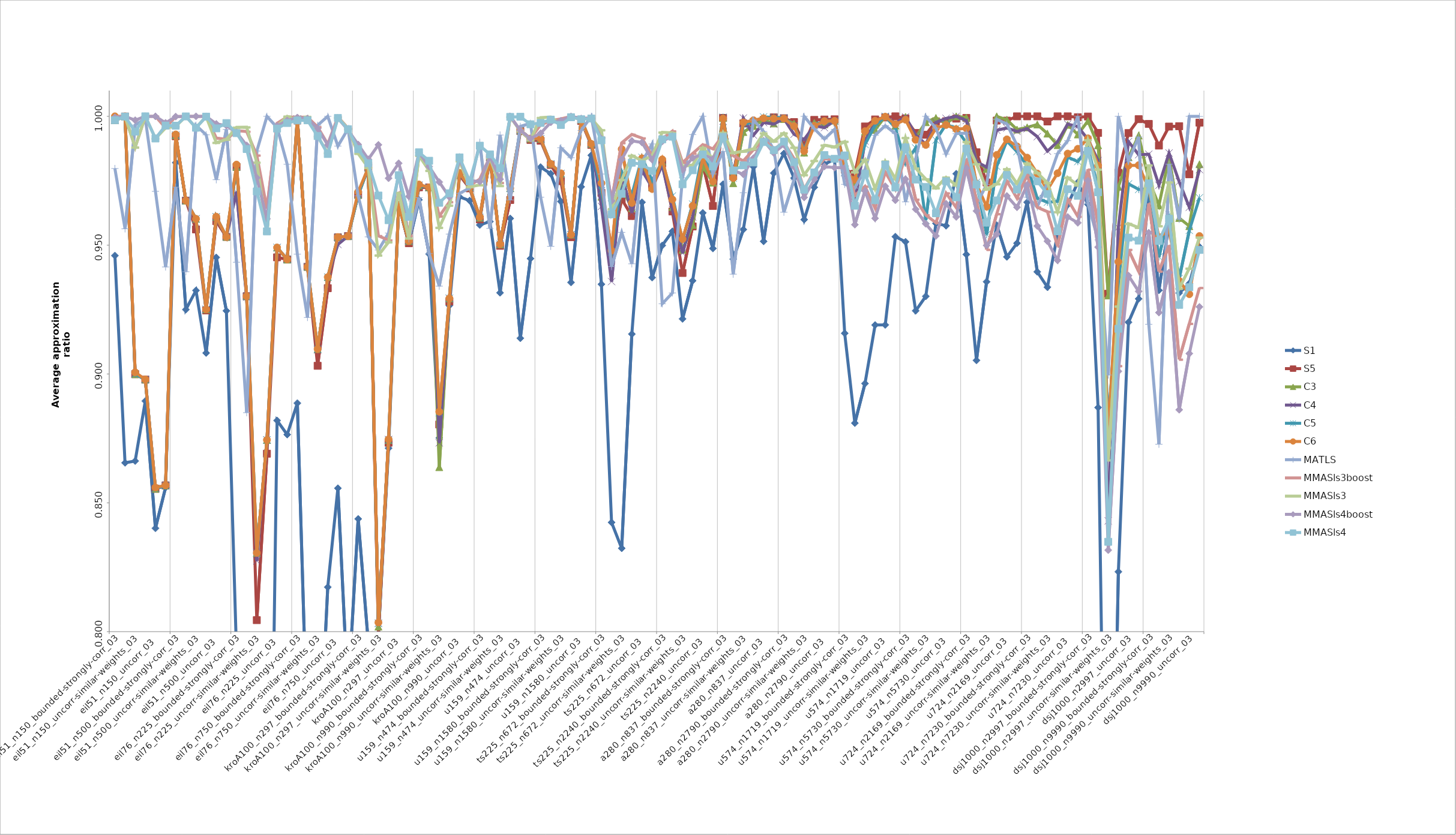
| Category | S1 | S5 | C3 | C4 | C5 | C6 | MATLS | MMASls3boost | MMASls3 | MMASls4boost | MMASls4 |
|---|---|---|---|---|---|---|---|---|---|---|---|
| eil51_n150_bounded-strongly-corr_03 | 0.946 | 0.999 | 0.999 | 0.999 | 0.999 | 1 | 0.98 | 1 | 0.999 | 1 | 0.999 |
| eil51_n150_bounded-strongly-corr_07 | 0.866 | 1 | 1 | 1 | 1 | 1 | 0.956 | 1 | 1 | 1 | 1 |
| eil51_n150_uncorr-similar-weights_03 | 0.866 | 0.9 | 0.9 | 0.9 | 0.9 | 0.901 | 0.997 | 0.988 | 0.988 | 0.998 | 0.994 |
| eil51_n150_uncorr-similar-weights_07 | 0.89 | 0.898 | 0.898 | 0.898 | 0.898 | 0.898 | 0.999 | 1 | 1 | 1 | 1 |
| eil51_n150_uncorr_03 | 0.84 | 0.855 | 0.855 | 0.856 | 0.855 | 0.856 | 0.971 | 1 | 0.991 | 1 | 0.991 |
| eil51_n150_uncorr_07 | 0.856 | 0.857 | 0.857 | 0.857 | 0.857 | 0.857 | 0.942 | 0.996 | 0.996 | 0.997 | 0.996 |
| eil51_n500_bounded-strongly-corr_03 | 0.982 | 0.992 | 0.993 | 0.993 | 0.993 | 0.993 | 0.973 | 1 | 0.996 | 1 | 0.996 |
| eil51_n500_bounded-strongly-corr_07 | 0.925 | 0.967 | 0.967 | 0.967 | 0.967 | 0.967 | 0.94 | 1 | 1 | 1 | 1 |
| eil51_n500_uncorr-similar-weights_03 | 0.932 | 0.956 | 0.96 | 0.96 | 0.96 | 0.96 | 0.997 | 1 | 0.996 | 1 | 0.996 |
| eil51_n500_uncorr-similar-weights_07 | 0.908 | 0.925 | 0.925 | 0.925 | 0.925 | 0.925 | 0.993 | 1 | 1 | 1 | 1 |
| eil51_n500_uncorr_03 | 0.945 | 0.959 | 0.961 | 0.961 | 0.961 | 0.961 | 0.975 | 0.992 | 0.99 | 0.997 | 0.995 |
| eil51_n500_uncorr_07 | 0.925 | 0.953 | 0.953 | 0.953 | 0.953 | 0.953 | 0.995 | 0.991 | 0.991 | 0.996 | 0.997 |
| eil76_n225_bounded-strongly-corr_03 | 0.792 | 0.98 | 0.98 | 0.971 | 0.98 | 0.981 | 0.943 | 0.994 | 0.996 | 0.994 | 0.993 |
| eil76_n225_bounded-strongly-corr_07 | 0.726 | 0.93 | 0.93 | 0.93 | 0.93 | 0.93 | 0.885 | 0.994 | 0.996 | 0.989 | 0.987 |
| eil76_n225_uncorr-similar-weights_03 | 0.575 | 0.804 | 0.831 | 0.827 | 0.831 | 0.831 | 0.987 | 0.985 | 0.982 | 0.976 | 0.971 |
| eil76_n225_uncorr-similar-weights_07 | 0.602 | 0.869 | 0.874 | 0.874 | 0.874 | 0.874 | 1 | 0.964 | 0.955 | 0.96 | 0.955 |
| eil76_n225_uncorr_03 | 0.882 | 0.945 | 0.949 | 0.949 | 0.949 | 0.949 | 0.996 | 0.997 | 0.996 | 0.996 | 0.995 |
| eil76_n225_uncorr_07 | 0.876 | 0.944 | 0.944 | 0.944 | 0.944 | 0.944 | 0.981 | 1 | 1 | 0.998 | 0.997 |
| eil76_n750_bounded-strongly-corr_03 | 0.889 | 0.998 | 0.999 | 0.999 | 0.999 | 0.999 | 0.947 | 1 | 0.998 | 1 | 0.998 |
| eil76_n750_bounded-strongly-corr_07 | 0.757 | 0.942 | 0.942 | 0.942 | 0.942 | 0.942 | 0.922 | 1 | 1 | 0.999 | 0.998 |
| eil76_n750_uncorr-similar-weights_03 | 0.736 | 0.903 | 0.91 | 0.909 | 0.91 | 0.91 | 0.997 | 0.996 | 0.992 | 0.995 | 0.992 |
| eil76_n750_uncorr-similar-weights_07 | 0.817 | 0.933 | 0.938 | 0.938 | 0.938 | 0.938 | 1 | 0.989 | 0.986 | 0.989 | 0.985 |
| eil76_n750_uncorr_03 | 0.856 | 0.953 | 0.953 | 0.95 | 0.953 | 0.953 | 0.988 | 1 | 1 | 0.999 | 0.999 |
| eil76_n750_uncorr_07 | 0.775 | 0.954 | 0.954 | 0.954 | 0.954 | 0.954 | 0.995 | 0.995 | 0.995 | 0.995 | 0.995 |
| kroA100_n297_bounded-strongly-corr_03 | 0.844 | 0.97 | 0.97 | 0.97 | 0.97 | 0.971 | 0.969 | 0.986 | 0.986 | 0.989 | 0.987 |
| kroA100_n297_bounded-strongly-corr_07 | 0.796 | 0.98 | 0.98 | 0.98 | 0.98 | 0.98 | 0.953 | 0.982 | 0.98 | 0.983 | 0.982 |
| kroA100_n297_uncorr-similar-weights_03 | 0.799 | 0.799 | 0.802 | 0.803 | 0.803 | 0.804 | 0.948 | 0.954 | 0.946 | 0.989 | 0.969 |
| kroA100_n297_uncorr-similar-weights_07 | 0.871 | 0.873 | 0.874 | 0.875 | 0.874 | 0.875 | 0.955 | 0.952 | 0.951 | 0.976 | 0.96 |
| kroA100_n297_uncorr_03 | 0.966 | 0.966 | 0.965 | 0.966 | 0.966 | 0.966 | 0.978 | 0.971 | 0.97 | 0.982 | 0.977 |
| kroA100_n297_uncorr_07 | 0.951 | 0.951 | 0.952 | 0.952 | 0.952 | 0.952 | 0.952 | 0.954 | 0.953 | 0.969 | 0.961 |
| kroA100_n990_bounded-strongly-corr_03 | 0.968 | 0.972 | 0.973 | 0.973 | 0.973 | 0.974 | 0.968 | 0.985 | 0.985 | 0.986 | 0.986 |
| kroA100_n990_bounded-strongly-corr_07 | 0.947 | 0.972 | 0.972 | 0.972 | 0.972 | 0.972 | 0.947 | 0.979 | 0.979 | 0.981 | 0.983 |
| kroA100_n990_uncorr-similar-weights_03 | 0.875 | 0.88 | 0.864 | 0.873 | 0.885 | 0.885 | 0.934 | 0.961 | 0.957 | 0.975 | 0.966 |
| kroA100_n990_uncorr-similar-weights_07 | 0.927 | 0.928 | 0.929 | 0.929 | 0.929 | 0.929 | 0.954 | 0.967 | 0.965 | 0.969 | 0.97 |
| kroA100_n990_uncorr_03 | 0.969 | 0.977 | 0.978 | 0.978 | 0.978 | 0.978 | 0.97 | 0.983 | 0.983 | 0.983 | 0.984 |
| kroA100_n990_uncorr_07 | 0.967 | 0.972 | 0.973 | 0.973 | 0.973 | 0.973 | 0.972 | 0.973 | 0.973 | 0.975 | 0.975 |
| u159_n474_bounded-strongly-corr_03 | 0.958 | 0.96 | 0.961 | 0.961 | 0.961 | 0.961 | 0.99 | 0.976 | 0.973 | 0.975 | 0.989 |
| u159_n474_bounded-strongly-corr_07 | 0.959 | 0.984 | 0.984 | 0.984 | 0.984 | 0.984 | 0.956 | 0.984 | 0.984 | 0.984 | 0.985 |
| u159_n474_uncorr-similar-weights_03 | 0.932 | 0.95 | 0.95 | 0.95 | 0.95 | 0.95 | 0.993 | 0.974 | 0.973 | 0.976 | 0.98 |
| u159_n474_uncorr-similar-weights_07 | 0.96 | 0.968 | 0.972 | 0.972 | 0.972 | 0.972 | 0.968 | 1 | 1 | 1 | 1 |
| u159_n474_uncorr_03 | 0.914 | 0.994 | 0.995 | 0.995 | 0.995 | 0.995 | 0.996 | 0.995 | 0.994 | 0.995 | 1 |
| u159_n474_uncorr_07 | 0.945 | 0.991 | 0.991 | 0.991 | 0.991 | 0.991 | 0.997 | 0.991 | 0.991 | 0.991 | 0.997 |
| u159_n1580_bounded-strongly-corr_03 | 0.98 | 0.991 | 0.991 | 0.991 | 0.991 | 0.991 | 0.969 | 0.997 | 0.999 | 0.993 | 0.997 |
| u159_n1580_bounded-strongly-corr_07 | 0.978 | 0.981 | 0.982 | 0.982 | 0.982 | 0.982 | 0.95 | 0.998 | 1 | 0.998 | 0.999 |
| u159_n1580_uncorr-similar-weights_03 | 0.967 | 0.975 | 0.978 | 0.978 | 0.978 | 0.978 | 0.988 | 0.999 | 0.997 | 0.998 | 0.997 |
| u159_n1580_uncorr-similar-weights_07 | 0.936 | 0.953 | 0.954 | 0.954 | 0.954 | 0.954 | 0.984 | 1 | 1 | 1 | 1 |
| u159_n1580_uncorr_03 | 0.973 | 0.998 | 0.999 | 0.999 | 0.999 | 0.999 | 0.995 | 0.999 | 0.999 | 0.999 | 0.999 |
| u159_n1580_uncorr_07 | 0.985 | 0.989 | 0.989 | 0.989 | 0.989 | 0.989 | 1 | 0.999 | 0.999 | 0.999 | 0.999 |
| ts225_n672_bounded-strongly-corr_03 | 0.935 | 0.97 | 0.969 | 0.965 | 0.971 | 0.974 | 0.978 | 0.992 | 0.995 | 0.991 | 0.991 |
| ts225_n672_bounded-strongly-corr_07 | 0.842 | 0.949 | 0.946 | 0.936 | 0.947 | 0.948 | 0.942 | 0.967 | 0.964 | 0.967 | 0.962 |
| ts225_n672_uncorr-similar-weights_03 | 0.832 | 0.968 | 0.972 | 0.977 | 0.979 | 0.987 | 0.955 | 0.99 | 0.975 | 0.983 | 0.97 |
| ts225_n672_uncorr-similar-weights_07 | 0.915 | 0.961 | 0.964 | 0.963 | 0.97 | 0.966 | 0.943 | 0.993 | 0.985 | 0.99 | 0.982 |
| ts225_n672_uncorr_03 | 0.967 | 0.981 | 0.981 | 0.979 | 0.984 | 0.984 | 0.982 | 0.992 | 0.983 | 0.99 | 0.981 |
| ts225_n672_uncorr_07 | 0.937 | 0.973 | 0.973 | 0.972 | 0.975 | 0.972 | 0.989 | 0.985 | 0.985 | 0.983 | 0.979 |
| ts225_n2240_bounded-strongly-corr_03 | 0.95 | 0.982 | 0.983 | 0.981 | 0.982 | 0.983 | 0.927 | 0.991 | 0.994 | 0.99 | 0.991 |
| ts225_n2240_bounded-strongly-corr_07 | 0.955 | 0.963 | 0.965 | 0.964 | 0.969 | 0.968 | 0.931 | 0.994 | 0.994 | 0.992 | 0.992 |
| ts225_n2240_uncorr-similar-weights_03 | 0.921 | 0.939 | 0.948 | 0.947 | 0.952 | 0.952 | 0.976 | 0.982 | 0.981 | 0.979 | 0.974 |
| ts225_n2240_uncorr-similar-weights_07 | 0.936 | 0.957 | 0.958 | 0.961 | 0.966 | 0.965 | 0.993 | 0.986 | 0.981 | 0.984 | 0.979 |
| ts225_n2240_uncorr_03 | 0.963 | 0.981 | 0.981 | 0.985 | 0.986 | 0.984 | 1 | 0.989 | 0.988 | 0.985 | 0.985 |
| ts225_n2240_uncorr_07 | 0.949 | 0.965 | 0.974 | 0.976 | 0.976 | 0.975 | 0.978 | 0.987 | 0.984 | 0.983 | 0.981 |
| a280_n837_bounded-strongly-corr_03 | 0.974 | 0.999 | 0.999 | 0.998 | 1 | 0.999 | 0.986 | 0.993 | 0.994 | 0.992 | 0.992 |
| a280_n837_bounded-strongly-corr_07 | 0.945 | 0.977 | 0.974 | 0.977 | 0.976 | 0.976 | 0.939 | 0.985 | 0.986 | 0.979 | 0.979 |
| a280_n837_uncorr-similar-weights_03 | 0.956 | 0.997 | 0.994 | 0.999 | 0.997 | 0.998 | 0.97 | 0.983 | 0.986 | 0.978 | 0.981 |
| a280_n837_uncorr-similar-weights_07 | 0.98 | 0.998 | 0.996 | 0.993 | 0.998 | 0.998 | 0.999 | 0.987 | 0.987 | 0.984 | 0.982 |
| a280_n837_uncorr_03 | 0.951 | 0.999 | 0.999 | 0.998 | 1 | 0.999 | 0.994 | 0.991 | 0.993 | 0.991 | 0.99 |
| a280_n837_uncorr_07 | 0.978 | 1 | 0.997 | 0.997 | 1 | 0.999 | 0.987 | 0.987 | 0.99 | 0.986 | 0.987 |
| a280_n2790_bounded-strongly-corr_03 | 0.986 | 0.999 | 0.999 | 0.999 | 0.999 | 0.999 | 0.963 | 0.99 | 0.993 | 0.989 | 0.99 |
| a280_n2790_bounded-strongly-corr_07 | 0.976 | 0.998 | 0.997 | 0.993 | 0.996 | 0.996 | 0.975 | 0.984 | 0.988 | 0.98 | 0.982 |
| a280_n2790_uncorr-similar-weights_03 | 0.96 | 0.989 | 0.986 | 0.991 | 0.987 | 0.987 | 1 | 0.972 | 0.977 | 0.969 | 0.972 |
| a280_n2790_uncorr-similar-weights_07 | 0.972 | 0.999 | 0.997 | 0.996 | 0.997 | 0.996 | 0.995 | 0.979 | 0.983 | 0.976 | 0.978 |
| a280_n2790_uncorr_03 | 0.981 | 0.999 | 0.997 | 0.996 | 0.998 | 0.998 | 0.991 | 0.984 | 0.989 | 0.981 | 0.985 |
| a280_n2790_uncorr_07 | 0.983 | 0.999 | 0.998 | 0.998 | 0.998 | 0.998 | 0.995 | 0.983 | 0.988 | 0.98 | 0.984 |
| u574_n1719_bounded-strongly-corr_03 | 0.916 | 0.979 | 0.98 | 0.978 | 0.978 | 0.979 | 0.974 | 0.984 | 0.99 | 0.98 | 0.985 |
| u574_n1719_bounded-strongly-corr_07 | 0.881 | 0.978 | 0.973 | 0.967 | 0.975 | 0.975 | 0.972 | 0.969 | 0.978 | 0.958 | 0.965 |
| u574_n1719_uncorr-similar-weights_03 | 0.896 | 0.996 | 0.994 | 0.99 | 0.989 | 0.994 | 0.979 | 0.973 | 0.983 | 0.971 | 0.978 |
| u574_n1719_uncorr-similar-weights_07 | 0.919 | 0.999 | 0.995 | 0.998 | 0.997 | 0.998 | 0.993 | 0.964 | 0.972 | 0.96 | 0.967 |
| u574_n1719_uncorr_03 | 0.919 | 1 | 1 | 1 | 1 | 1 | 0.996 | 0.978 | 0.983 | 0.973 | 0.981 |
| u574_n1719_uncorr_07 | 0.953 | 1 | 0.996 | 0.997 | 0.996 | 0.997 | 0.993 | 0.972 | 0.976 | 0.967 | 0.972 |
| u574_n5730_bounded-strongly-corr_03 | 0.951 | 0.999 | 1 | 1 | 0.982 | 0.999 | 0.967 | 0.985 | 0.992 | 0.976 | 0.988 |
| u574_n5730_bounded-strongly-corr_07 | 0.925 | 0.994 | 0.992 | 0.993 | 0.988 | 0.991 | 0.983 | 0.968 | 0.98 | 0.964 | 0.975 |
| u574_n5730_uncorr-similar-weights_03 | 0.93 | 0.993 | 0.998 | 0.989 | 0.96 | 0.989 | 1 | 0.962 | 0.976 | 0.958 | 0.973 |
| u574_n5730_uncorr-similar-weights_07 | 0.958 | 0.998 | 0.999 | 0.998 | 0.991 | 0.995 | 0.995 | 0.959 | 0.972 | 0.954 | 0.962 |
| u574_n5730_uncorr_03 | 0.958 | 0.998 | 0.997 | 0.999 | 0.997 | 0.997 | 0.985 | 0.97 | 0.976 | 0.966 | 0.975 |
| u574_n5730_uncorr_07 | 0.978 | 0.999 | 1 | 1 | 0.995 | 0.995 | 0.993 | 0.965 | 0.973 | 0.961 | 0.969 |
| u724_n2169_bounded-strongly-corr_03 | 0.946 | 0.999 | 1 | 0.998 | 0.99 | 0.995 | 0.993 | 0.984 | 0.99 | 0.98 | 0.987 |
| u724_n2169_bounded-strongly-corr_07 | 0.905 | 0.986 | 0.983 | 0.982 | 0.974 | 0.974 | 0.966 | 0.968 | 0.982 | 0.963 | 0.974 |
| u724_n2169_uncorr-similar-weights_03 | 0.936 | 0.974 | 0.98 | 0.98 | 0.954 | 0.965 | 0.974 | 0.948 | 0.972 | 0.95 | 0.959 |
| u724_n2169_uncorr-similar-weights_07 | 0.958 | 0.998 | 1 | 0.995 | 0.981 | 0.985 | 0.999 | 0.962 | 0.974 | 0.954 | 0.967 |
| u724_n2169_uncorr_03 | 0.945 | 0.998 | 0.999 | 0.995 | 0.99 | 0.991 | 0.997 | 0.975 | 0.98 | 0.969 | 0.977 |
| u724_n2169_uncorr_07 | 0.951 | 1 | 0.995 | 0.994 | 0.986 | 0.988 | 0.989 | 0.968 | 0.974 | 0.965 | 0.972 |
| u724_n7230_bounded-strongly-corr_03 | 0.967 | 1 | 0.996 | 0.995 | 0.981 | 0.984 | 0.969 | 0.977 | 0.982 | 0.973 | 0.979 |
| u724_n7230_bounded-strongly-corr_07 | 0.94 | 1 | 0.997 | 0.992 | 0.968 | 0.978 | 0.965 | 0.965 | 0.978 | 0.957 | 0.975 |
| u724_n7230_uncorr-similar-weights_03 | 0.934 | 0.998 | 0.993 | 0.986 | 0.967 | 0.971 | 0.974 | 0.963 | 0.974 | 0.952 | 0.97 |
| u724_n7230_uncorr-similar-weights_07 | 0.954 | 1 | 0.989 | 0.99 | 0.967 | 0.978 | 0.986 | 0.95 | 0.963 | 0.944 | 0.955 |
| u724_n7230_uncorr_03 | 0.966 | 1 | 0.997 | 0.997 | 0.984 | 0.986 | 0.991 | 0.968 | 0.976 | 0.961 | 0.972 |
| u724_n7230_uncorr_07 | 0.974 | 1 | 0.993 | 0.996 | 0.982 | 0.987 | 1 | 0.961 | 0.973 | 0.959 | 0.969 |
| dsj1000_n2997_bounded-strongly-corr_03 | 0.966 | 1 | 0.998 | 0.991 | 0.988 | 0.991 | 0.966 | 0.979 | 0.991 | 0.975 | 0.987 |
| dsj1000_n2997_bounded-strongly-corr_07 | 0.887 | 0.994 | 0.989 | 0.983 | 0.972 | 0.981 | 0.952 | 0.958 | 0.979 | 0.949 | 0.971 |
| dsj1000_n2997_uncorr-similar-weights_03 | 0.622 | 0.931 | 0.93 | 0.843 | 0.88 | 0.876 | 0.9 | 0.871 | 0.867 | 0.832 | 0.835 |
| dsj1000_n2997_uncorr-similar-weights_07 | 0.823 | 0.978 | 0.973 | 0.957 | 0.935 | 0.944 | 1 | 0.903 | 0.926 | 0.901 | 0.918 |
| dsj1000_n2997_uncorr_03 | 0.92 | 0.994 | 0.984 | 0.99 | 0.974 | 0.981 | 0.983 | 0.948 | 0.958 | 0.938 | 0.953 |
| dsj1000_n2997_uncorr_07 | 0.929 | 0.999 | 0.993 | 0.985 | 0.972 | 0.981 | 0.992 | 0.94 | 0.957 | 0.932 | 0.952 |
| dsj1000_n9990_bounded-strongly-corr_03 | 0.97 | 0.997 | 0.975 | 0.985 | 0.972 | 0.972 | 0.919 | 0.966 | 0.981 | 0.955 | 0.974 |
| dsj1000_n9990_bounded-strongly-corr_07 | 0.932 | 0.989 | 0.965 | 0.973 | 0.945 | 0.953 | 0.873 | 0.94 | 0.957 | 0.924 | 0.952 |
| dsj1000_n9990_uncorr-similar-weights_03 | 0.959 | 0.996 | 0.984 | 0.986 | 0.962 | 0.956 | 0.981 | 0.95 | 0.974 | 0.939 | 0.96 |
| dsj1000_n9990_uncorr-similar-weights_07 | 0.931 | 0.996 | 0.961 | 0.975 | 0.937 | 0.936 | 0.96 | 0.906 | 0.933 | 0.886 | 0.927 |
| dsj1000_n9990_uncorr_03 | 0.935 | 0.978 | 0.957 | 0.965 | 0.956 | 0.931 | 1 | 0.92 | 0.941 | 0.908 | 0.934 |
| dsj1000_n9990_uncorr_07 | 0.949 | 0.998 | 0.981 | 0.979 | 0.968 | 0.954 | 1 | 0.933 | 0.953 | 0.926 | 0.948 |